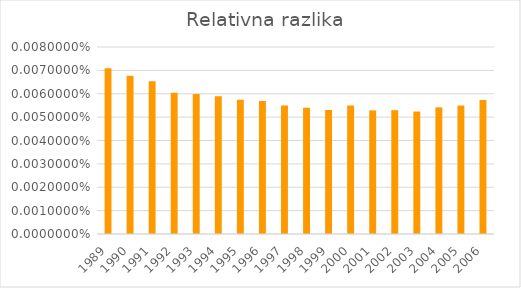
| Category | Series 0 |
|---|---|
| 1989.0 | 0 |
| 1990.0 | 0 |
| 1991.0 | 0 |
| 1992.0 | 0 |
| 1993.0 | 0 |
| 1994.0 | 0 |
| 1995.0 | 0 |
| 1996.0 | 0 |
| 1997.0 | 0 |
| 1998.0 | 0 |
| 1999.0 | 0 |
| 2000.0 | 0 |
| 2001.0 | 0 |
| 2002.0 | 0 |
| 2003.0 | 0 |
| 2004.0 | 0 |
| 2005.0 | 0 |
| 2006.0 | 0 |